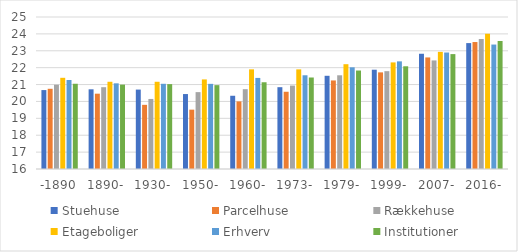
| Category | Stuehuse | Parcelhuse | Rækkehuse | Etageboliger | Erhverv | Institutioner |
|---|---|---|---|---|---|---|
| -1890 | 20.673 | 20.75 | 20.992 | 21.4 | 21.271 | 21.047 |
| 1890- | 20.719 | 20.46 | 20.843 | 21.165 | 21.073 | 20.997 |
| 1930- | 20.702 | 19.799 | 20.147 | 21.165 | 21.045 | 21.025 |
| 1950- | 20.438 | 19.514 | 20.552 | 21.304 | 21.041 | 20.965 |
| 1960- | 20.336 | 20.002 | 20.726 | 21.9 | 21.393 | 21.136 |
| 1973- | 20.845 | 20.573 | 20.94 | 21.899 | 21.55 | 21.418 |
| 1979- | 21.519 | 21.243 | 21.549 | 22.205 | 22.022 | 21.831 |
| 1999- | 21.879 | 21.721 | 21.793 | 22.311 | 22.374 | 22.082 |
| 2007- | 22.824 | 22.606 | 22.429 | 22.935 | 22.897 | 22.803 |
| 2016- | 23.455 | 23.517 | 23.699 | 24.008 | 23.369 | 23.581 |